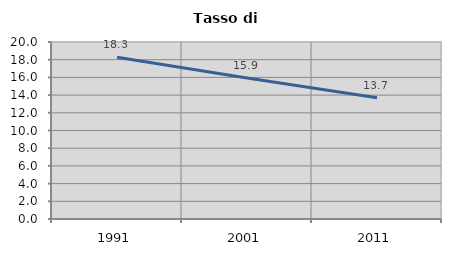
| Category | Tasso di disoccupazione   |
|---|---|
| 1991.0 | 18.28 |
| 2001.0 | 15.937 |
| 2011.0 | 13.712 |